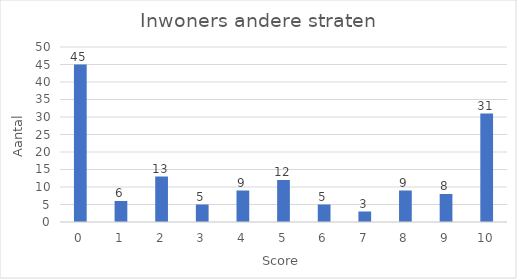
| Category | Aantal |
|---|---|
| 0.0 | 45 |
| 1.0 | 6 |
| 2.0 | 13 |
| 3.0 | 5 |
| 4.0 | 9 |
| 5.0 | 12 |
| 6.0 | 5 |
| 7.0 | 3 |
| 8.0 | 9 |
| 9.0 | 8 |
| 10.0 | 31 |